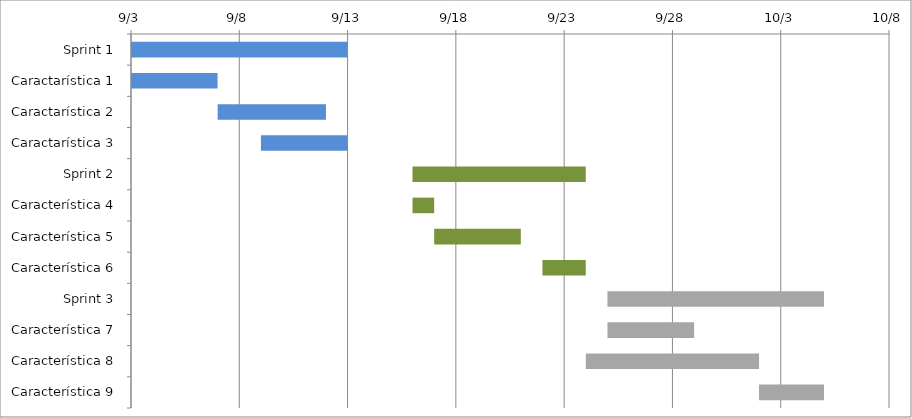
| Category | Fecha de inicio | Días |
|---|---|---|
| Sprint 1 | 2016-09-03 | 10 |
| Caractarística 1 | 2016-09-03 | 4 |
| Caractarística 2 | 2016-09-07 | 5 |
| Caractarística 3 | 2016-09-09 | 4 |
| Sprint 2 | 2016-09-16 | 8 |
| Característica 4 | 2016-09-16 | 1 |
| Característica 5 | 2016-09-17 | 4 |
| Característica 6 | 2016-09-22 | 2 |
| Sprint 3 | 2016-09-25 | 10 |
| Característica 7 | 2016-09-25 | 4 |
| Característica 8 | 2016-09-24 | 8 |
| Característica 9 | 2016-10-02 | 3 |